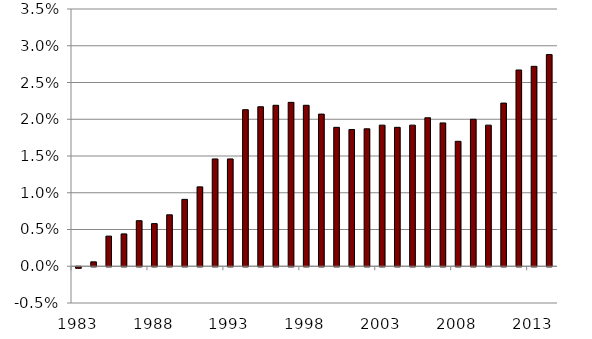
| Category | Deficit |
|---|---|
| 1983.0 | 0 |
| 1984.0 | 0.001 |
| 1985.0 | 0.004 |
| 1986.0 | 0.004 |
| 1987.0 | 0.006 |
| 1988.0 | 0.006 |
| 1989.0 | 0.007 |
| 1990.0 | 0.009 |
| 1991.0 | 0.011 |
| 1992.0 | 0.015 |
| 1993.0 | 0.015 |
| 1994.0 | 0.021 |
| 1995.0 | 0.022 |
| 1996.0 | 0.022 |
| 1997.0 | 0.022 |
| 1998.0 | 0.022 |
| 1999.0 | 0.021 |
| 2000.0 | 0.019 |
| 2001.0 | 0.019 |
| 2002.0 | 0.019 |
| 2003.0 | 0.019 |
| 2004.0 | 0.019 |
| 2005.0 | 0.019 |
| 2006.0 | 0.02 |
| 2007.0 | 0.02 |
| 2008.0 | 0.017 |
| 2009.0 | 0.02 |
| 2010.0 | 0.019 |
| 2011.0 | 0.022 |
| 2012.0 | 0.027 |
| 2013.0 | 0.027 |
| 2014.0 | 0.029 |